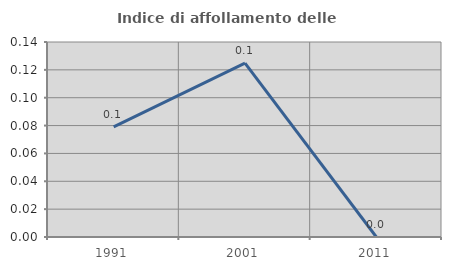
| Category | Indice di affollamento delle abitazioni  |
|---|---|
| 1991.0 | 0.079 |
| 2001.0 | 0.125 |
| 2011.0 | 0 |